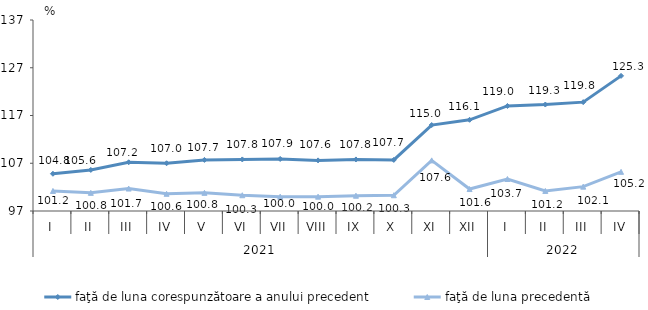
| Category | faţă de luna corespunzătoare a anului precedent | faţă de luna precedentă   |
|---|---|---|
| 0 | 104.8 | 101.2 |
| 1 | 105.6 | 100.8 |
| 2 | 107.2 | 101.7 |
| 3 | 107 | 100.6 |
| 4 | 107.7 | 100.8 |
| 5 | 107.8 | 100.3 |
| 6 | 107.9 | 100 |
| 7 | 107.6 | 100 |
| 8 | 107.8 | 100.2 |
| 9 | 107.7 | 100.3 |
| 10 | 115 | 107.6 |
| 11 | 116.1 | 101.6 |
| 12 | 119 | 103.7 |
| 13 | 119.3 | 101.2 |
| 14 | 119.8 | 102.1 |
| 15 | 125.3 | 105.2 |